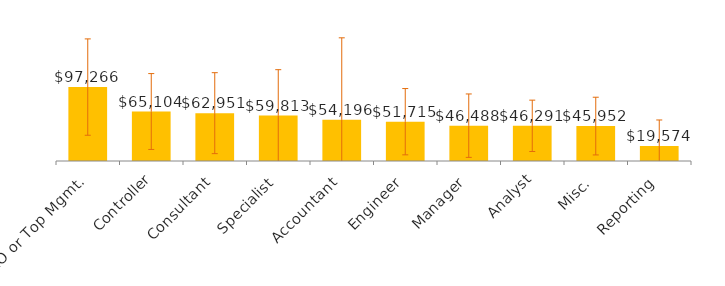
| Category | Total |
|---|---|
| CXO or Top Mgmt. | 97265.876 |
| Controller | 65103.929 |
| Consultant | 62950.733 |
| Specialist | 59812.969 |
| Accountant | 54196.441 |
| Engineer | 51715.151 |
| Manager | 46488.241 |
| Analyst | 46290.777 |
| Misc. | 45952.334 |
| Reporting | 19574.159 |